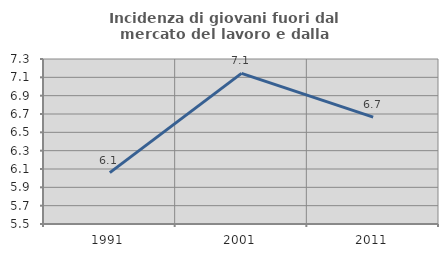
| Category | Incidenza di giovani fuori dal mercato del lavoro e dalla formazione  |
|---|---|
| 1991.0 | 6.061 |
| 2001.0 | 7.143 |
| 2011.0 | 6.667 |